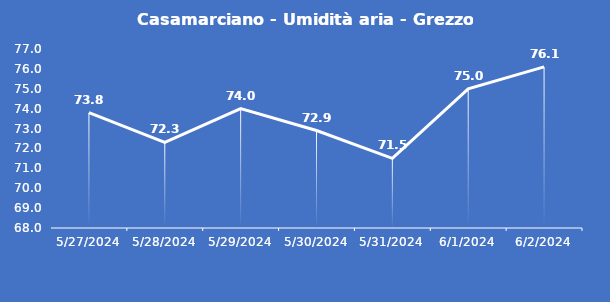
| Category | Casamarciano - Umidità aria - Grezzo (%) |
|---|---|
| 5/27/24 | 73.8 |
| 5/28/24 | 72.3 |
| 5/29/24 | 74 |
| 5/30/24 | 72.9 |
| 5/31/24 | 71.5 |
| 6/1/24 | 75 |
| 6/2/24 | 76.1 |